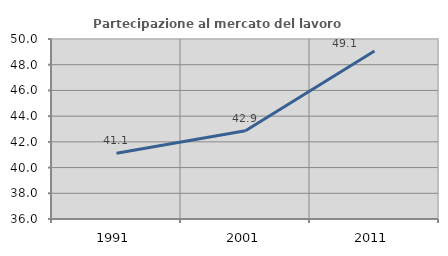
| Category | Partecipazione al mercato del lavoro  femminile |
|---|---|
| 1991.0 | 41.121 |
| 2001.0 | 42.857 |
| 2011.0 | 49.074 |